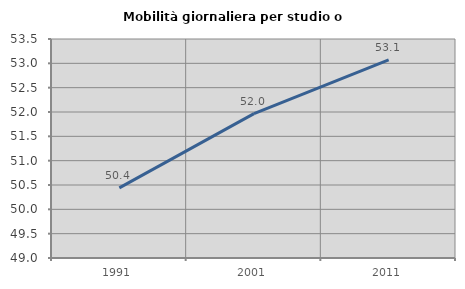
| Category | Mobilità giornaliera per studio o lavoro |
|---|---|
| 1991.0 | 50.441 |
| 2001.0 | 51.966 |
| 2011.0 | 53.072 |